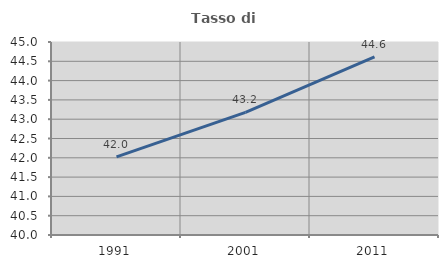
| Category | Tasso di occupazione   |
|---|---|
| 1991.0 | 42.023 |
| 2001.0 | 43.178 |
| 2011.0 | 44.615 |